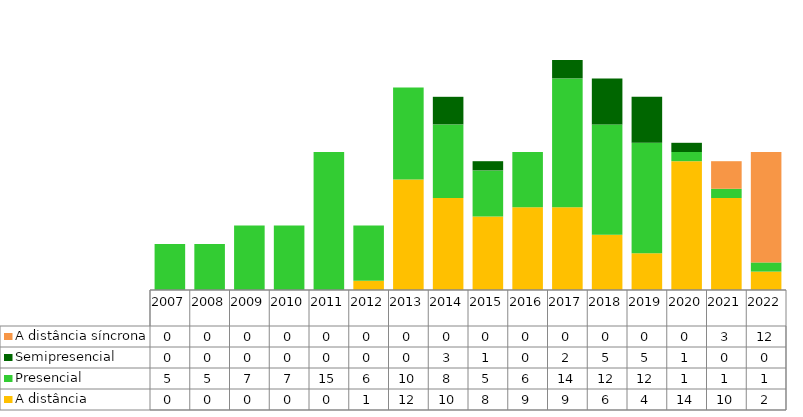
| Category | A distância | Presencial | Semipresencial | A distância síncrona |
|---|---|---|---|---|
| 2007.0 | 0 | 5 | 0 | 0 |
| 2008.0 | 0 | 5 | 0 | 0 |
| 2009.0 | 0 | 7 | 0 | 0 |
| 2010.0 | 0 | 7 | 0 | 0 |
| 2011.0 | 0 | 15 | 0 | 0 |
| 2012.0 | 1 | 6 | 0 | 0 |
| 2013.0 | 12 | 10 | 0 | 0 |
| 2014.0 | 10 | 8 | 3 | 0 |
| 2015.0 | 8 | 5 | 1 | 0 |
| 2016.0 | 9 | 6 | 0 | 0 |
| 2017.0 | 9 | 14 | 2 | 0 |
| 2018.0 | 6 | 12 | 5 | 0 |
| 2019.0 | 4 | 12 | 5 | 0 |
| 2020.0 | 14 | 1 | 1 | 0 |
| 2021.0 | 10 | 1 | 0 | 3 |
| 2022.0 | 2 | 1 | 0 | 12 |